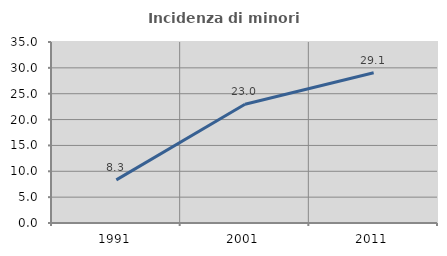
| Category | Incidenza di minori stranieri |
|---|---|
| 1991.0 | 8.333 |
| 2001.0 | 22.963 |
| 2011.0 | 29.054 |